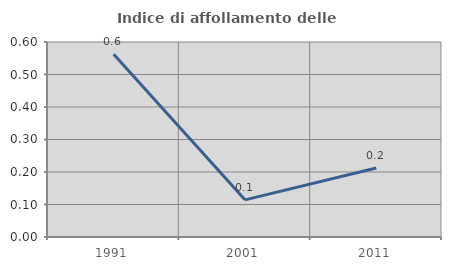
| Category | Indice di affollamento delle abitazioni  |
|---|---|
| 1991.0 | 0.562 |
| 2001.0 | 0.114 |
| 2011.0 | 0.212 |